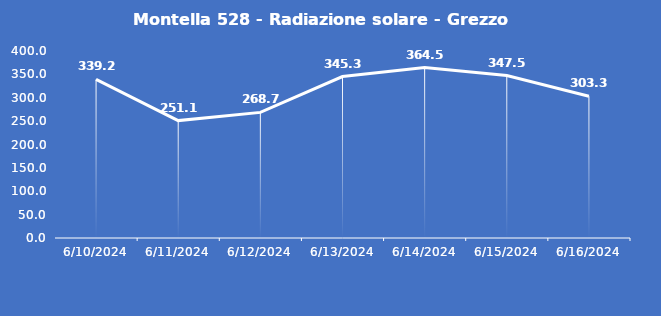
| Category | Montella 528 - Radiazione solare - Grezzo (W/m2) |
|---|---|
| 6/10/24 | 339.2 |
| 6/11/24 | 251.1 |
| 6/12/24 | 268.7 |
| 6/13/24 | 345.3 |
| 6/14/24 | 364.5 |
| 6/15/24 | 347.5 |
| 6/16/24 | 303.3 |